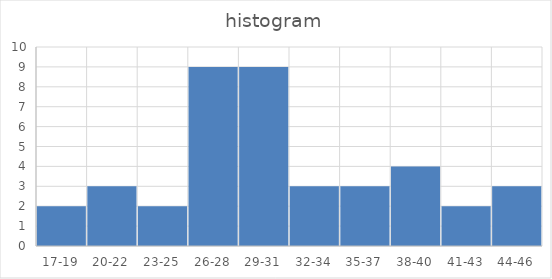
| Category | freq |
|---|---|
| 17-19 | 2 |
| 20-22 | 3 |
| 23-25 | 2 |
| 26-28 | 9 |
| 29-31 | 9 |
| 32-34 | 3 |
| 35-37 | 3 |
| 38-40 | 4 |
| 41-43 | 2 |
| 44-46 | 3 |